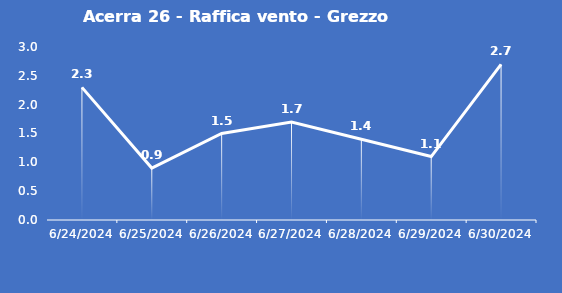
| Category | Acerra 26 - Raffica vento - Grezzo (m/s) |
|---|---|
| 6/24/24 | 2.3 |
| 6/25/24 | 0.9 |
| 6/26/24 | 1.5 |
| 6/27/24 | 1.7 |
| 6/28/24 | 1.4 |
| 6/29/24 | 1.1 |
| 6/30/24 | 2.7 |